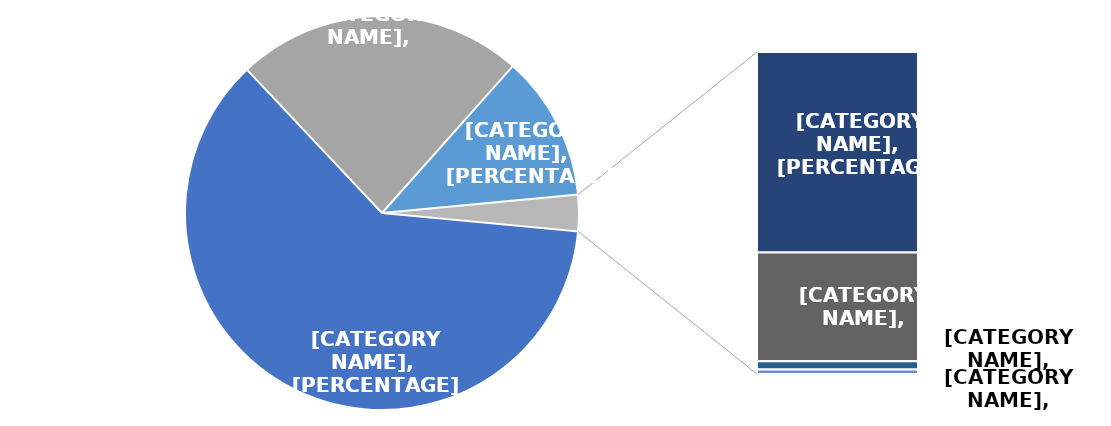
| Category | Series 0 |
|---|---|
| Investment Loan | 3047817332.324 |
| Policy-based loan | 1170360000 |
| Other instruments | 591267587 |
| Advisory Services | 92198776.25 |
| Investment Grant | 49999861.616 |
| Equity | 3780000 |
| Guarantee | 2125000 |